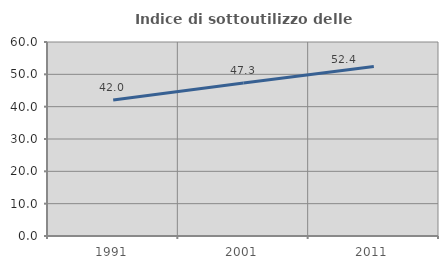
| Category | Indice di sottoutilizzo delle abitazioni  |
|---|---|
| 1991.0 | 42.038 |
| 2001.0 | 47.333 |
| 2011.0 | 52.439 |